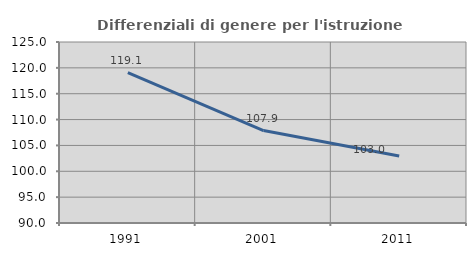
| Category | Differenziali di genere per l'istruzione superiore |
|---|---|
| 1991.0 | 119.07 |
| 2001.0 | 107.883 |
| 2011.0 | 102.956 |